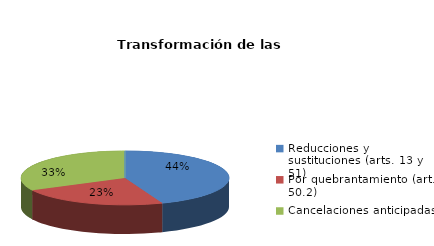
| Category | Series 0 |
|---|---|
| Reducciones y sustituciones (arts. 13 y 51) | 19 |
| Por quebrantamiento (art. 50.2) | 10 |
| Cancelaciones anticipadas | 14 |
| Traslado a Centros Penitenciarios | 0 |
| Conversión internamientos en cerrados (art. 51.2) | 0 |